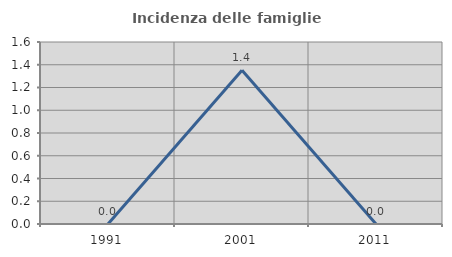
| Category | Incidenza delle famiglie numerose |
|---|---|
| 1991.0 | 0 |
| 2001.0 | 1.351 |
| 2011.0 | 0 |